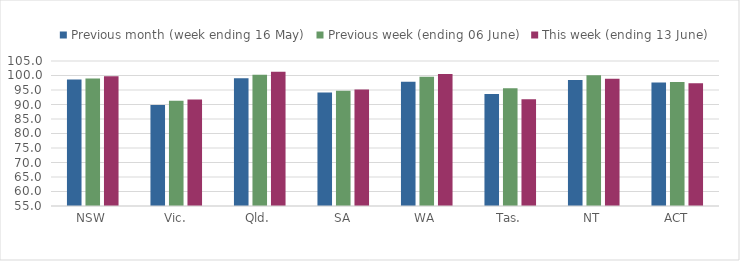
| Category | Previous month (week ending 16 May) | Previous week (ending 06 June) | This week (ending 13 June) |
|---|---|---|---|
| NSW | 98.601 | 98.934 | 99.777 |
| Vic. | 89.856 | 91.259 | 91.75 |
| Qld. | 99.092 | 100.283 | 101.266 |
| SA | 94.148 | 94.707 | 95.174 |
| WA | 97.827 | 99.569 | 100.49 |
| Tas. | 93.599 | 95.621 | 91.784 |
| NT | 98.412 | 100.097 | 98.909 |
| ACT | 97.547 | 97.765 | 97.287 |